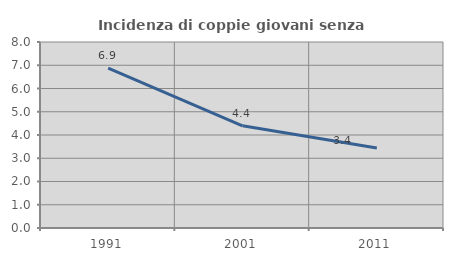
| Category | Incidenza di coppie giovani senza figli |
|---|---|
| 1991.0 | 6.879 |
| 2001.0 | 4.398 |
| 2011.0 | 3.442 |